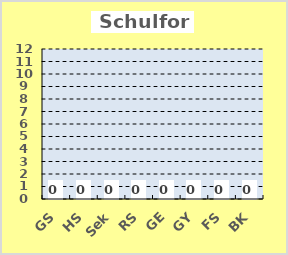
| Category | Series 0 |
|---|---|
| GS | 0 |
| HS | 0 |
| Sek | 0 |
| RS | 0 |
| GE | 0 |
| GY | 0 |
| FS | 0 |
| BK | 0 |